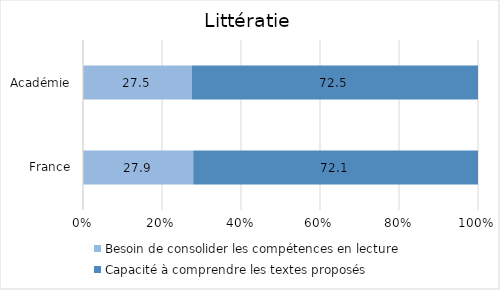
| Category | Besoin de consolider les compétences en lecture | Capacité à comprendre les textes proposés |
|---|---|---|
| France | 27.9 | 72.1 |
| Académie | 27.5 | 72.5 |